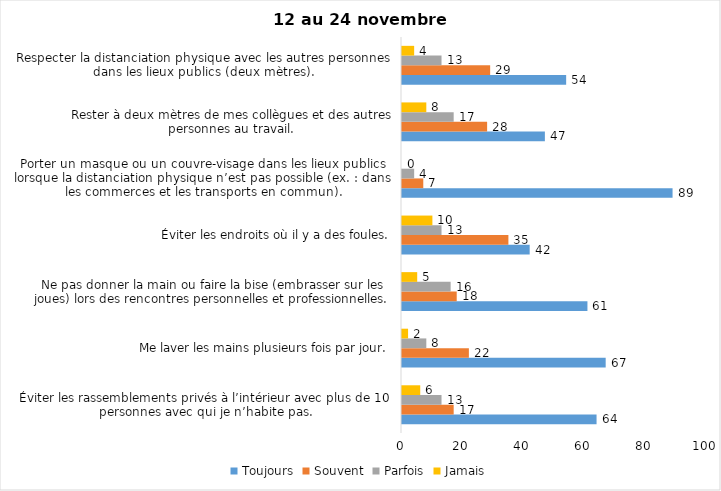
| Category | Toujours | Souvent | Parfois | Jamais |
|---|---|---|---|---|
| Éviter les rassemblements privés à l’intérieur avec plus de 10 personnes avec qui je n’habite pas. | 64 | 17 | 13 | 6 |
| Me laver les mains plusieurs fois par jour. | 67 | 22 | 8 | 2 |
| Ne pas donner la main ou faire la bise (embrasser sur les joues) lors des rencontres personnelles et professionnelles. | 61 | 18 | 16 | 5 |
| Éviter les endroits où il y a des foules. | 42 | 35 | 13 | 10 |
| Porter un masque ou un couvre-visage dans les lieux publics lorsque la distanciation physique n’est pas possible (ex. : dans les commerces et les transports en commun). | 89 | 7 | 4 | 0 |
| Rester à deux mètres de mes collègues et des autres personnes au travail. | 47 | 28 | 17 | 8 |
| Respecter la distanciation physique avec les autres personnes dans les lieux publics (deux mètres). | 54 | 29 | 13 | 4 |